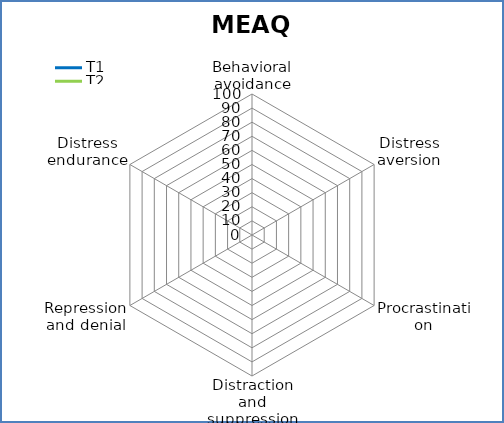
| Category | T1 | T2 |
|---|---|---|
| Behavioral avoidance | 0 | 0 |
| Distress aversion | 0 | 0 |
| Procrastination | 0 | 0 |
| Distraction and suppression | 0 | 0 |
| Repression and denial | 0 | 0 |
| Distress endurance | 0 | 0 |